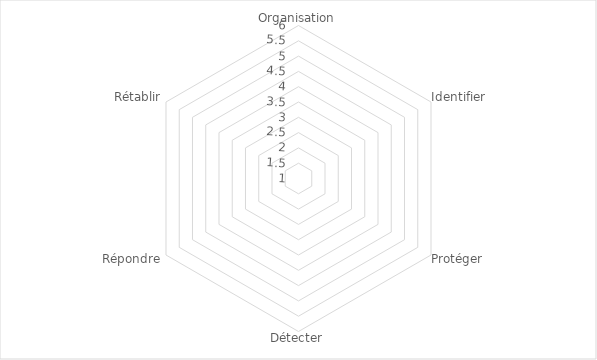
| Category | Series 0 |
|---|---|
| Organisation | 1 |
| Identifier | 1 |
| Protéger | 1 |
| Détecter | 1 |
| Répondre | 1 |
| Rétablir | 1 |